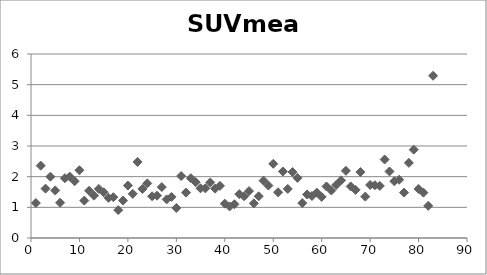
| Category | SUVmean |
|---|---|
| 1.0 | 1.14 |
| 2.0 | 2.36 |
| 3.0 | 1.61 |
| 4.0 | 2 |
| 5.0 | 1.55 |
| 6.0 | 1.15 |
| 7.0 | 1.95 |
| 8.0 | 2 |
| 9.0 | 1.85 |
| 10.0 | 2.21 |
| 11.0 | 1.22 |
| 12.0 | 1.54 |
| 13.0 | 1.38 |
| 14.0 | 1.6 |
| 15.0 | 1.49 |
| 16.0 | 1.31 |
| 17.0 | 1.33 |
| 18.0 | 0.91 |
| 19.0 | 1.22 |
| 20.0 | 1.71 |
| 21.0 | 1.44 |
| 22.0 | 2.48 |
| 23.0 | 1.6 |
| 24.0 | 1.78 |
| 25.0 | 1.36 |
| 26.0 | 1.38 |
| 27.0 | 1.66 |
| 28.0 | 1.26 |
| 29.0 | 1.34 |
| 30.0 | 0.98 |
| 31.0 | 2.02 |
| 32.0 | 1.48 |
| 33.0 | 1.95 |
| 34.0 | 1.82 |
| 35.0 | 1.62 |
| 36.0 | 1.62 |
| 37.0 | 1.81 |
| 38.0 | 1.61 |
| 39.0 | 1.7 |
| 40.0 | 1.12 |
| 41.0 | 1.03 |
| 42.0 | 1.1 |
| 43.0 | 1.43 |
| 44.0 | 1.36 |
| 45.0 | 1.53 |
| 46.0 | 1.13 |
| 47.0 | 1.36 |
| 48.0 | 1.87 |
| 49.0 | 1.71 |
| 50.0 | 2.42 |
| 51.0 | 1.49 |
| 52.0 | 2.17 |
| 53.0 | 1.6 |
| 54.0 | 2.15 |
| 55.0 | 1.96 |
| 56.0 | 1.14 |
| 57.0 | 1.42 |
| 58.0 | 1.37 |
| 59.0 | 1.48 |
| 60.0 | 1.34 |
| 61.0 | 1.68 |
| 62.0 | 1.55 |
| 63.0 | 1.73 |
| 64.0 | 1.88 |
| 65.0 | 2.19 |
| 66.0 | 1.68 |
| 67.0 | 1.57 |
| 68.0 | 2.15 |
| 69.0 | 1.35 |
| 70.0 | 1.73 |
| 71.0 | 1.72 |
| 72.0 | 1.7 |
| 73.0 | 2.56 |
| 74.0 | 2.17 |
| 75.0 | 1.85 |
| 76.0 | 1.9 |
| 77.0 | 1.48 |
| 78.0 | 2.45 |
| 79.0 | 2.88 |
| 80.0 | 1.6 |
| 81.0 | 1.48 |
| 82.0 | 1.05 |
| 83.0 | 5.29 |